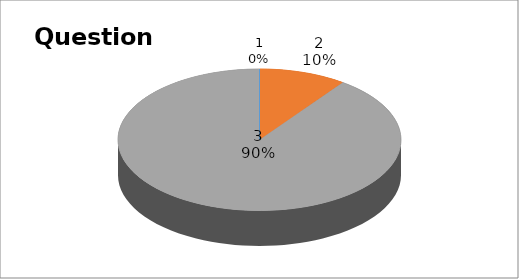
| Category | Series 0 |
|---|---|
| 0 | 0 |
| 1 | 1 |
| 2 | 9 |